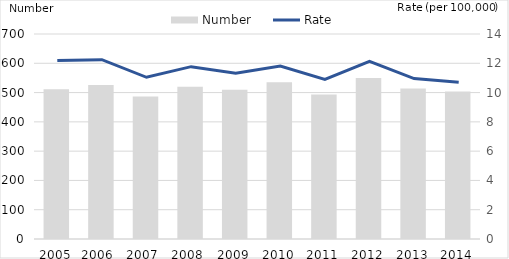
| Category | Number |
|---|---|
| 2005 | 511 |
| 2006  | 526 |
| 2007  | 487 |
| 2008  | 520 |
| 2009 | 510 |
| 2010 | 535 |
| 2011 | 493 |
| 2012 | 550 |
| 2013 | 514 |
| 2014 | 504 |